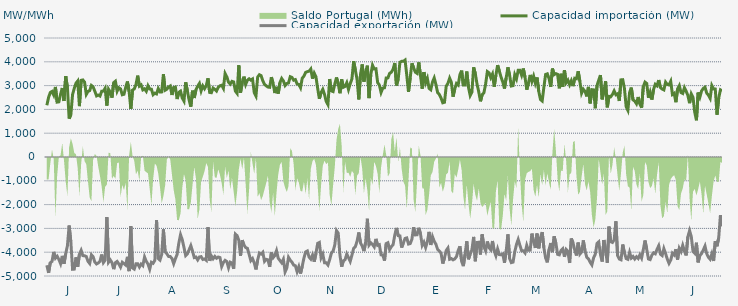
| Category | Capacidad importación (MW) | Capacidad exportación (MW) |
|---|---|---|
| 0 | 2173.125 | -4548.75 |
| 1900-01-01 | 2501.25 | -4869.375 |
| 1900-01-02 | 2709.375 | -4443.75 |
| 1900-01-03 | 2754.375 | -4389.375 |
| 1900-01-04 | 2602.5 | -3988.125 |
| 1900-01-05 | 2943.75 | -4250.625 |
| 1900-01-06 | 2304.917 | -4167.5 |
| 1900-01-07 | 2317.5 | -4303.125 |
| 1900-01-08 | 2636.25 | -4481.25 |
| 1900-01-09 | 2900.625 | -4155 |
| 1900-01-10 | 2354.375 | -4488.75 |
| 1900-01-11 | 3395.625 | -4059.375 |
| 1900-01-12 | 2919.375 | -3729.375 |
| 1900-01-13 | 1612.5 | -2879.583 |
| 1900-01-14 | 1777.708 | -3564.375 |
| 1900-01-15 | 2624.875 | -4719.375 |
| 1900-01-16 | 2883.75 | -4711.875 |
| 1900-01-17 | 3101.25 | -4216.875 |
| 1900-01-18 | 3193.125 | -4616.25 |
| 1900-01-19 | 2137.5 | -4083.75 |
| 1900-01-20 | 3221.25 | -3922.5 |
| 1900-01-21 | 3238.125 | -4143.75 |
| 1900-01-22 | 3146.25 | -4149.375 |
| 1900-01-23 | 2629.583 | -4181.25 |
| 1900-01-24 | 2756.25 | -4383.75 |
| 1900-01-25 | 2791.875 | -4475.625 |
| 1900-01-26 | 3005.625 | -4110 |
| 1900-01-27 | 2943.75 | -4190.625 |
| 1900-01-28 | 2761.875 | -4417.5 |
| 1900-01-29 | 2566.875 | -4494.375 |
| 1900-01-30 | 2602.5 | -4453.125 |
| 1900-01-31 | 2561.25 | -4380 |
| 1900-02-01 | 2763.75 | -4098.75 |
| 1900-02-02 | 2769.375 | -4436.25 |
| 1900-02-03 | 2887.5 | -4333.125 |
| 1900-02-04 | 2159.625 | -2520.833 |
| 1900-02-05 | 2846.25 | -4423.125 |
| 1900-02-06 | 2730 | -4323.75 |
| 1900-02-07 | 2491.875 | -4438.125 |
| 1900-02-08 | 3123.75 | -4711.875 |
| 1900-02-09 | 3183.75 | -4440 |
| 1900-02-10 | 2761.875 | -4387.5 |
| 1900-02-11 | 2908.125 | -4496.25 |
| 1900-02-12 | 2861.25 | -4627.5 |
| 1900-02-13 | 2615.625 | -4421.25 |
| 1900-02-14 | 2636.25 | -4479.375 |
| 1900-02-15 | 2925 | -4541.25 |
| 1900-02-16 | 3172.917 | -4194.583 |
| 1900-02-17 | 2752.5 | -4794.375 |
| 1900-02-18 | 2024.208 | -2912.083 |
| 1900-02-19 | 2810.625 | -4661.25 |
| 1900-02-20 | 2859.375 | -4710 |
| 1900-02-21 | 3043.125 | -4486.875 |
| 1900-02-22 | 3418.125 | -4485 |
| 1900-02-23 | 2977.5 | -4623.75 |
| 1900-02-24 | 3028.125 | -4498.125 |
| 1900-02-25 | 2820 | -4565.625 |
| 1900-02-26 | 2863.125 | -4200 |
| 1900-02-27 | 2761.875 | -4381.875 |
| 1900-02-28 | 2994.375 | -4500 |
| 1900-02-28 | 2857.5 | -4715.625 |
| 1900-03-01 | 2850 | -4423.125 |
| 1900-03-02 | 2617.5 | -4466.25 |
| 1900-03-03 | 2681.25 | -4346.25 |
| 1900-03-04 | 2650 | -2650 |
| 1900-03-05 | 2876.25 | -4267.5 |
| 1900-03-06 | 2733.333 | -4333.125 |
| 1900-03-07 | 2735.625 | -4098.75 |
| 1900-03-08 | 3479.167 | -3041.667 |
| 1900-03-09 | 2805 | -3984.375 |
| 1900-03-10 | 2846.25 | -4065 |
| 1900-03-11 | 2941.875 | -4177.5 |
| 1900-03-12 | 2985 | -4183.125 |
| 1900-03-13 | 2606.25 | -4265.625 |
| 1900-03-14 | 2921.25 | -4481.25 |
| 1900-03-15 | 2938.125 | -4273.125 |
| 1900-03-16 | 2435 | -4091.25 |
| 1900-03-17 | 2716.875 | -3618.75 |
| 1900-03-18 | 2767.5 | -3264.375 |
| 1900-03-19 | 2476.875 | -3474.375 |
| 1900-03-20 | 2349.375 | -3798.75 |
| 1900-03-21 | 3142.5 | -4141.875 |
| 1900-03-22 | 2773.125 | -4066.875 |
| 1900-03-23 | 2390.625 | -3896.25 |
| 1900-03-24 | 2113.125 | -3723.75 |
| 1900-03-25 | 2786.25 | -3954.375 |
| 1900-03-26 | 2480.625 | -4226.25 |
| 1900-03-27 | 2829.375 | -4203.75 |
| 1900-03-28 | 2973.75 | -4323.75 |
| 1900-03-29 | 3090 | -4200 |
| 1900-03-30 | 2778.75 | -4186.875 |
| 1900-03-31 | 2986.875 | -4305 |
| 1900-04-01 | 2868.75 | -4282.5 |
| 1900-04-02 | 3000 | -4340.625 |
| 1900-04-03 | 3307.5 | -2947.5 |
| 1900-04-04 | 2713.125 | -4359.375 |
| 1900-04-05 | 2701.875 | -4158.75 |
| 1900-04-06 | 2896.875 | -4276.875 |
| 1900-04-07 | 2842.5 | -4177.5 |
| 1900-04-08 | 2773.125 | -4254.375 |
| 1900-04-09 | 2930.625 | -4201.875 |
| 1900-04-10 | 2990.625 | -4224.375 |
| 1900-04-11 | 3015 | -4603.125 |
| 1900-04-12 | 2883.75 | -4436.25 |
| 1900-04-13 | 3506.25 | -4342.5 |
| 1900-04-14 | 3367.5 | -4393.125 |
| 1900-04-15 | 3144.375 | -4653.75 |
| 1900-04-16 | 3063.75 | -4419.375 |
| 1900-04-17 | 3178.125 | -4456.875 |
| 1900-04-18 | 3153.75 | -4695 |
| 1900-04-19 | 2768.542 | -3240.125 |
| 1900-04-20 | 2672.083 | -3304.625 |
| 1900-04-21 | 3855 | -3498.75 |
| 1900-04-22 | 2703.125 | -4151.25 |
| 1900-04-23 | 3123.333 | -3495.125 |
| 1900-04-24 | 3376.875 | -3697.5 |
| 1900-04-25 | 3048.75 | -3805.875 |
| 1900-04-26 | 3225 | -3836.25 |
| 1900-04-27 | 3286.875 | -4085.625 |
| 1900-04-28 | 3230.625 | -4353.75 |
| 1900-04-29 | 3279.375 | -4267.5 |
| 1900-04-30 | 2704.917 | -4449.375 |
| 1900-05-01 | 2563.833 | -4725 |
| 1900-05-02 | 3360 | -4325.625 |
| 1900-05-03 | 3457.5 | -4035 |
| 1900-05-04 | 3420 | -4078.125 |
| 1900-05-05 | 3202.5 | -4005 |
| 1900-05-06 | 3050.625 | -4383.75 |
| 1900-05-07 | 2992.5 | -4301.25 |
| 1900-05-08 | 2938.125 | -4320 |
| 1900-05-09 | 2928.75 | -4614.375 |
| 1900-05-10 | 3356.25 | -4010.625 |
| 1900-05-11 | 3093.75 | -4231.875 |
| 1900-05-12 | 2686.875 | -4143.75 |
| 1900-05-13 | 2947.5 | -3935.625 |
| 1900-05-14 | 2664.375 | -4254.375 |
| 1900-05-15 | 3127.5 | -4350 |
| 1900-05-16 | 3300 | -4443.75 |
| 1900-05-17 | 3198.542 | -4296 |
| 1900-05-18 | 3001.875 | -4828.125 |
| 1900-05-19 | 3088.125 | -4666.875 |
| 1900-05-20 | 3110.625 | -4215 |
| 1900-05-21 | 3373.125 | -4336.875 |
| 1900-05-22 | 3345 | -4417.5 |
| 1900-05-23 | 3226.875 | -4541.25 |
| 1900-05-24 | 3251.25 | -4569.375 |
| 1900-05-25 | 3069.375 | -4816.875 |
| 1900-05-26 | 3046.875 | -4610.625 |
| 1900-05-27 | 2910 | -4897.5 |
| 1900-05-28 | 3309.375 | -4593.75 |
| 1900-05-29 | 3399.792 | -4243 |
| 1900-05-30 | 3556.875 | -3988.125 |
| 1900-05-31 | 3585.6 | -3948.08 |
| 1900-06-01 | 3605.625 | -4208.542 |
| 1900-06-02 | 3697.5 | -4290 |
| 1900-06-03 | 3291.25 | -4115.625 |
| 1900-06-04 | 3523.125 | -4398.75 |
| 1900-06-05 | 3371.25 | -4055.625 |
| 1900-06-06 | 2883.75 | -3628.125 |
| 1900-06-07 | 2445 | -3590.625 |
| 1900-06-08 | 2711.25 | -4233.75 |
| 1900-06-09 | 2842.292 | -4080 |
| 1900-06-10 | 2631.042 | -4443.75 |
| 1900-06-11 | 2333.542 | -4443.75 |
| 1900-06-12 | 2201.25 | -4537.5 |
| 1900-06-13 | 3275.625 | -4314.375 |
| 1900-06-14 | 2778.75 | -4038.75 |
| 1900-06-15 | 2749.167 | -3955 |
| 1900-06-16 | 3064.375 | -3696.875 |
| 1900-06-17 | 3341.083 | -3091.583 |
| 1900-06-18 | 3070.042 | -3200 |
| 1900-06-19 | 2678.625 | -4117.917 |
| 1900-06-20 | 3264.375 | -4610.625 |
| 1900-06-21 | 2928.75 | -4363.125 |
| 1900-06-22 | 2966.25 | -4316.25 |
| 1900-06-23 | 3121.875 | -4074.375 |
| 1900-06-24 | 2836.875 | -4230 |
| 1900-06-25 | 3078.75 | -4385.625 |
| 1900-06-26 | 3281.25 | -4121.25 |
| 1900-06-27 | 4027.5 | -3836.25 |
| 1900-06-28 | 3646.875 | -3765 |
| 1900-06-29 | 3256.875 | -3536.25 |
| 1900-06-30 | 2419.833 | -3170.625 |
| 1900-07-01 | 3472.5 | -3611.25 |
| 1900-07-02 | 3890.625 | -3742.5 |
| 1900-07-03 | 3166.875 | -3954.375 |
| 1900-07-04 | 3577.5 | -3583.125 |
| 1900-07-05 | 3836 | -2595.625 |
| 1900-07-06 | 2475 | -3700 |
| 1900-07-07 | 3466.875 | -3605.625 |
| 1900-07-08 | 3856.875 | -3676.458 |
| 1900-07-09 | 3697.5 | -3778.125 |
| 1900-07-10 | 3708.75 | -3440.625 |
| 1900-07-11 | 3125.625 | -3712.5 |
| 1900-07-12 | 3026.792 | -3685.625 |
| 1900-07-13 | 2711.458 | -4111.875 |
| 1900-07-14 | 2894.583 | -4117.5 |
| 1900-07-15 | 2908.583 | -4353.75 |
| 1900-07-16 | 3321.875 | -3639.375 |
| 1900-07-17 | 3324.375 | -3603.75 |
| 1900-07-18 | 3515.833 | -3886.875 |
| 1900-07-19 | 3562.5 | -3763.125 |
| 1900-07-20 | 3684.792 | -3688.125 |
| 1900-07-21 | 3950.625 | -3281.25 |
| 1900-07-22 | 3006.042 | -2979.375 |
| 1900-07-23 | 3276.667 | -3305.625 |
| 1900-07-24 | 3978.75 | -3315 |
| 1900-07-25 | 4018.125 | -3806.25 |
| 1900-07-26 | 4020 | -3611.25 |
| 1900-07-27 | 4072.5 | -3421.458 |
| 1900-07-28 | 3435 | -3400.208 |
| 1900-07-29 | 2733.458 | -3658.125 |
| 1900-07-30 | 3328.542 | -3637.5 |
| 1900-07-31 | 3937.5 | -3451.875 |
| 1900-08-01 | 3746.25 | -2948.958 |
| 1900-08-02 | 3564.375 | -3273.75 |
| 1900-08-03 | 3513.75 | -3266.25 |
| 1900-08-04 | 3975 | -2973.75 |
| 1900-08-05 | 3418.125 | -3228.75 |
| 1900-08-06 | 2868.75 | -3712.5 |
| 1900-08-07 | 3568.125 | -3577.5 |
| 1900-08-08 | 3120 | -3802.5 |
| 1900-08-09 | 3305.625 | -3564.375 |
| 1900-08-10 | 2884.375 | -3145.875 |
| 1900-08-11 | 2826.25 | -3695.625 |
| 1900-08-12 | 3149.792 | -3346.875 |
| 1900-08-13 | 3321.458 | -3540 |
| 1900-08-14 | 3048.75 | -3665.625 |
| 1900-08-15 | 2704.25 | -3881.25 |
| 1900-08-16 | 2627.25 | -3950.625 |
| 1900-08-17 | 2475.708 | -4038.75 |
| 1900-08-18 | 2277.917 | -4477.5 |
| 1900-08-19 | 2300 | -4239.375 |
| 1900-08-20 | 2972.708 | -3928.125 |
| 1900-08-21 | 3093.75 | -3825 |
| 1900-08-22 | 3313.333 | -4297.5 |
| 1900-08-23 | 3141.75 | -4268.125 |
| 1900-08-24 | 2533.125 | -4321.875 |
| 1900-08-25 | 2863.375 | -4282.5 |
| 1900-08-26 | 3088.125 | -4185 |
| 1900-08-27 | 3024.375 | -3931.875 |
| 1900-08-28 | 3459.375 | -3751.875 |
| 1900-08-29 | 3630 | -4380 |
| 1900-08-30 | 3020.625 | -4586.25 |
| 1900-08-31 | 3020.625 | -4091.25 |
| 1900-09-01 | 3592.5 | -3540 |
| 1900-09-02 | 2925 | -4297.5 |
| 1900-09-03 | 2582.625 | -4080.542 |
| 1900-09-04 | 2730 | -3900.625 |
| 1900-09-05 | 3769.167 | -3357.25 |
| 1900-09-06 | 3498.625 | -4380 |
| 1900-09-07 | 3058.125 | -3591.583 |
| 1900-09-08 | 2735.625 | -3581.875 |
| 1900-09-09 | 2339.792 | -4096.875 |
| 1900-09-10 | 2622.625 | -3250.667 |
| 1900-09-11 | 2697.5 | -3770.625 |
| 1900-09-12 | 3064.167 | -3943.625 |
| 1900-09-13 | 3588.75 | -3549.375 |
| 1900-09-14 | 3535.75 | -3810 |
| 1900-09-15 | 3333.958 | -3898.125 |
| 1900-09-16 | 3486.625 | -3530.542 |
| 1900-09-17 | 2951.375 | -3943.125 |
| 1900-09-18 | 3439.375 | -4149.375 |
| 1900-09-19 | 3860.625 | -3864.375 |
| 1900-09-20 | 3609.583 | -4100.625 |
| 1900-09-21 | 3359.75 | -4110 |
| 1900-09-22 | 3152.25 | -4073.75 |
| 1900-09-23 | 2876.25 | -4441.875 |
| 1900-09-24 | 3331.25 | -3948.75 |
| 1900-09-25 | 3768.75 | -3251.25 |
| 1900-09-26 | 3435.667 | -4269.375 |
| 1900-09-27 | 2984.167 | -4438.125 |
| 1900-09-28 | 2998.583 | -4415.625 |
| 1900-09-29 | 3457.333 | -3980.625 |
| 1900-09-30 | 3283.042 | -3676.875 |
| 1900-10-01 | 3641.25 | -3464.5 |
| 1900-10-02 | 3640.708 | -3708.75 |
| 1900-10-03 | 3435.708 | -3937.5 |
| 1900-10-04 | 3718.125 | -3943.125 |
| 1900-10-05 | 3344.458 | -4031.25 |
| 1900-10-06 | 2827.083 | -3710.625 |
| 1900-10-07 | 3113.75 | -3920.625 |
| 1900-10-08 | 3448.125 | -3913.125 |
| 1900-10-09 | 3172.083 | -3219.375 |
| 1900-10-10 | 3397.5 | -3562.5 |
| 1900-10-11 | 3101.042 | -3819.375 |
| 1900-10-12 | 3341.25 | -3215.625 |
| 1900-10-13 | 2760.833 | -3838.125 |
| 1900-10-14 | 2417.5 | -3395.625 |
| 1900-10-15 | 2354.583 | -3155.625 |
| 1900-10-16 | 2936.875 | -3811.875 |
| 1900-10-17 | 3468.75 | -4241.25 |
| 1900-10-18 | 3495 | -4426.875 |
| 1900-10-19 | 3297.083 | -3890.625 |
| 1900-10-20 | 2946.292 | -3613.125 |
| 1900-10-21 | 3714.792 | -3997.5 |
| 1900-10-22 | 3460.833 | -3331.875 |
| 1900-10-23 | 3502.917 | -3618.5 |
| 1900-10-24 | 3472.5 | -4089.375 |
| 1900-10-25 | 2885.87 | -4111.304 |
| 1900-10-26 | 3496.875 | -3930 |
| 1900-10-27 | 2942.5 | -3858.75 |
| 1900-10-28 | 3650.625 | -4194.375 |
| 1900-10-29 | 3122.458 | -3885 |
| 1900-10-30 | 3230.042 | -3961.875 |
| 1900-10-31 | 3034.208 | -4453.125 |
| 1900-11-01 | 3206.25 | -3423.75 |
| 1900-11-02 | 2977.5 | -3611.25 |
| 1900-11-03 | 3309.375 | -3911.25 |
| 1900-11-04 | 3288.75 | -4138.125 |
| 1900-11-05 | 3602.833 | -3596.25 |
| 1900-11-06 | 3174.375 | -4080 |
| 1900-11-07 | 2683.667 | -3991.875 |
| 1900-11-08 | 2848.875 | -3504.833 |
| 1900-11-09 | 2758.542 | -3938.333 |
| 1900-11-10 | 2545.417 | -4209.375 |
| 1900-11-11 | 2945.625 | -4278.75 |
| 1900-11-12 | 2252.5 | -4423.125 |
| 1900-11-13 | 2829.375 | -4533.75 |
| 1900-11-14 | 2820.917 | -4235.625 |
| 1900-11-15 | 2048.125 | -4081.208 |
| 1900-11-16 | 3003.75 | -3632.292 |
| 1900-11-17 | 3232.5 | -3565.625 |
| 1900-11-18 | 3440.625 | -4096.875 |
| 1900-11-19 | 2422.5 | -4393.125 |
| 1900-11-20 | 2763.958 | -3487.5 |
| 1900-11-21 | 3183.75 | -3943.125 |
| 1900-11-22 | 2087.083 | -4443.75 |
| 1900-11-23 | 2547 | -2925.75 |
| 1900-11-24 | 2531.667 | -3560.625 |
| 1900-11-25 | 2628.75 | -3590.625 |
| 1900-11-26 | 2778.75 | -3480 |
| 1900-11-27 | 2617.292 | -2701.792 |
| 1900-11-28 | 2655 | -4141.875 |
| 1900-11-29 | 2355.417 | -4288.125 |
| 1900-11-30 | 3240.75 | -4318.125 |
| 1900-12-01 | 3247.5 | -3676.875 |
| 1900-12-02 | 2878.042 | -4025.625 |
| 1900-12-03 | 2109.167 | -4269.375 |
| 1900-12-04 | 1961.042 | -4299.375 |
| 1900-12-05 | 2710.208 | -4003.125 |
| 1900-12-06 | 2916 | -4248.333 |
| 1900-12-07 | 2401.875 | -4179.375 |
| 1900-12-08 | 2351.25 | -4286.25 |
| 1900-12-09 | 2238.75 | -4192.5 |
| 1900-12-10 | 2520 | -4265.625 |
| 1900-12-11 | 2227.5 | -4108.125 |
| 1900-12-12 | 2070.583 | -4246.875 |
| 1900-12-13 | 2958.75 | -3892.5 |
| 1900-12-14 | 3146.25 | -3508.125 |
| 1900-12-15 | 3087.5 | -3877.5 |
| 1900-12-16 | 2487.5 | -4284.375 |
| 1900-12-17 | 2722.5 | -4310.625 |
| 1900-12-18 | 2411.25 | -4125 |
| 1900-12-19 | 2840.5 | -4025.625 |
| 1900-12-20 | 3054.5 | -4066.875 |
| 1900-12-21 | 2992.958 | -3879.375 |
| 1900-12-22 | 3232.5 | -3729.375 |
| 1900-12-23 | 2917.5 | -4085.625 |
| 1900-12-24 | 2853.75 | -4141.875 |
| 1900-12-25 | 2819.458 | -3849.375 |
| 1900-12-26 | 3145.042 | -4061.25 |
| 1900-12-27 | 3046.958 | -4290 |
| 1900-12-28 | 3028.125 | -4468.125 |
| 1900-12-29 | 3180.542 | -4331.25 |
| 1900-12-30 | 2624.958 | -4042.5 |
| 1900-12-31 | 2676.25 | -4115.625 |
| 1901-01-01 | 2302.5 | -3873.75 |
| 1901-01-02 | 2854.208 | -4308.75 |
| 1901-01-03 | 2997.833 | -3837.167 |
| 1901-01-04 | 2709.375 | -3973.125 |
| 1901-01-05 | 2670 | -3712.958 |
| 1901-01-06 | 2913.75 | -3958.125 |
| 1901-01-07 | 2765.625 | -4134.375 |
| 1901-01-08 | 2587.5 | -3352.5 |
| 1901-01-09 | 2261.25 | -3093.75 |
| 1901-01-10 | 2651.25 | -3345.208 |
| 1901-01-11 | 2510.625 | -3963.75 |
| 1901-01-12 | 1885.875 | -4044.375 |
| 1901-01-13 | 1541.5 | -3601.375 |
| 1901-01-14 | 2707.5 | -4426.875 |
| 1901-01-15 | 2516.25 | -4128.75 |
| 1901-01-16 | 2775 | -4059.375 |
| 1901-01-17 | 2883.75 | -3906.667 |
| 1901-01-18 | 2930.625 | -3742.5 |
| 1901-01-19 | 2685 | -4061.25 |
| 1901-01-20 | 2596.875 | -4213.125 |
| 1901-01-21 | 2463.75 | -4295.625 |
| 1901-01-22 | 3005.625 | -4065 |
| 1901-01-23 | 2861.25 | -4370.625 |
| 1901-01-24 | 2855.083 | -3533.583 |
| 1901-01-25 | 1775.625 | -3751.875 |
| 1901-01-26 | 2478.75 | -3391.875 |
| 1901-01-27 | 2821.875 | -2444.375 |
| 1901-01-28 | 2782.5 | -2903.75 |